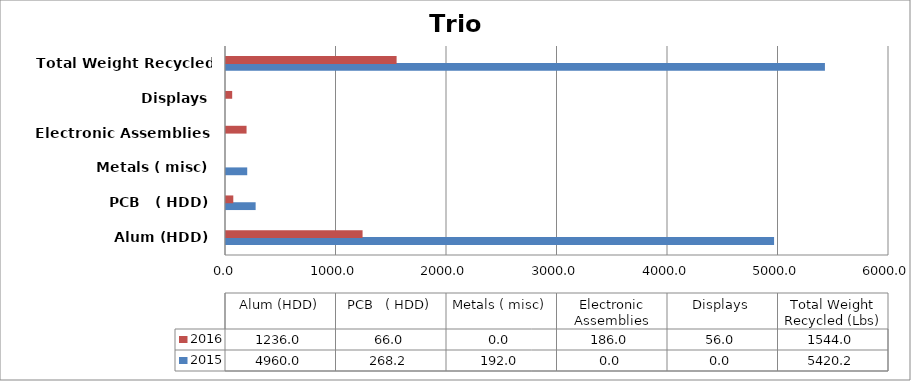
| Category | 2015 | 2016 |
|---|---|---|
| Alum (HDD) | 4960 | 1236 |
| PCB   ( HDD) | 268.2 | 66 |
| Metals ( misc) | 192 | 0 |
| Electronic Assemblies | 0 | 186 |
| Displays | 0 | 56 |
| Total Weight Recycled (Lbs) | 5420.2 | 1544 |